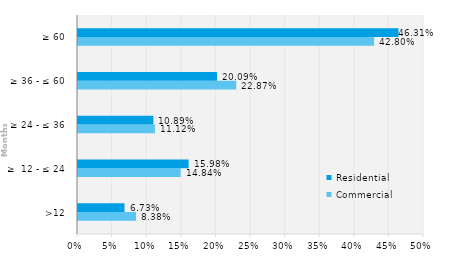
| Category | Commercial | Residential |
|---|---|---|
| >12 | 0.084 | 0.067 |
| ≥  12 - ≤ 24 | 0.148 | 0.16 |
| ≥ 24 - ≤ 36 | 0.111 | 0.109 |
| ≥ 36 - ≤ 60 | 0.229 | 0.201 |
| ≥ 60 | 0.428 | 0.463 |